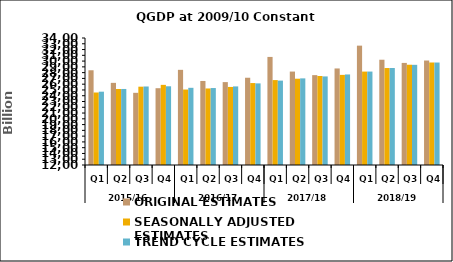
| Category | ORIGINAL ESTIMATES | SEASONALLY ADJUSTED ESTIMATES | TREND CYCLE ESTIMATES |
|---|---|---|---|
| 0 | 28411.246 | 24558.526 | 24699.838 |
| 1 | 26228.783 | 25168.866 | 25170.982 |
| 2 | 24503.419 | 25566.939 | 25600.702 |
| 3 | 25303.519 | 25881.739 | 25635.364 |
| 4 | 28485.585 | 25074.759 | 25371.664 |
| 5 | 26556.754 | 25257.79 | 25332.225 |
| 6 | 26359.326 | 25522.161 | 25614.358 |
| 7 | 27116.376 | 26194.119 | 26138.607 |
| 8 | 30721.31 | 26709.843 | 26617.999 |
| 9 | 28185.425 | 26946.729 | 27006.708 |
| 10 | 27567.514 | 27415.5 | 27344.701 |
| 11 | 28723.159 | 27610.722 | 27684.836 |
| 12 | 32675.491 | 28181.948 | 28185.858 |
| 13 | 30235.225 | 28798.164 | 28799.352 |
| 14 | 29683.739 | 29368.556 | 29354.072 |
| 15 | 30099.247 | 29756.946 | 29750.991 |